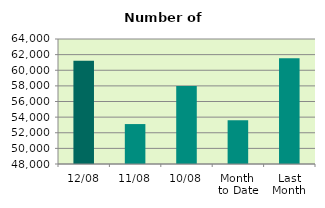
| Category | Series 0 |
|---|---|
| 12/08 | 61218 |
| 11/08 | 53112 |
| 10/08 | 58000 |
| Month 
to Date | 53612 |
| Last
Month | 61549.619 |